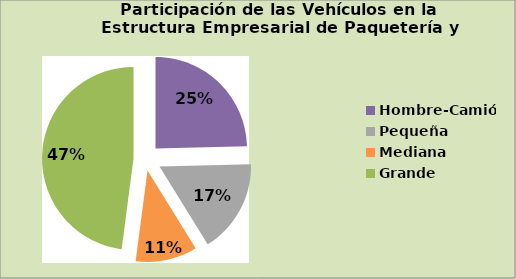
| Category | Series 0 |
|---|---|
| Hombre-Camión | 24.619 |
| Pequeña | 16.558 |
| Mediana | 10.893 |
| Grande | 47.93 |